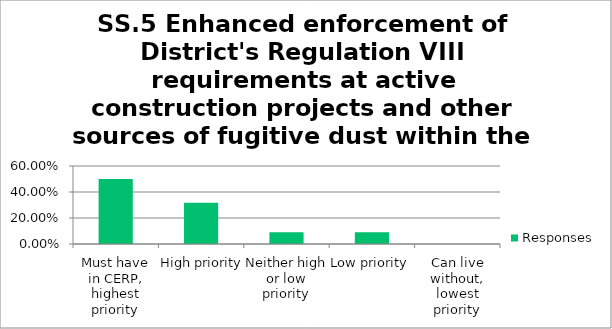
| Category | Responses |
|---|---|
| Must have in CERP, highest priority | 0.5 |
| High priority | 0.318 |
| Neither high or low priority | 0.091 |
| Low priority | 0.091 |
| Can live without, lowest priority | 0 |